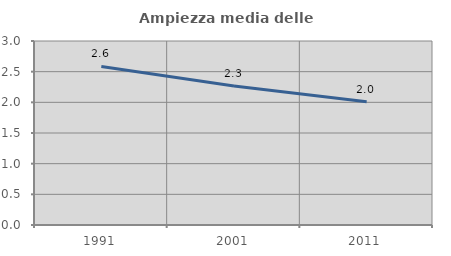
| Category | Ampiezza media delle famiglie |
|---|---|
| 1991.0 | 2.584 |
| 2001.0 | 2.266 |
| 2011.0 | 2.01 |